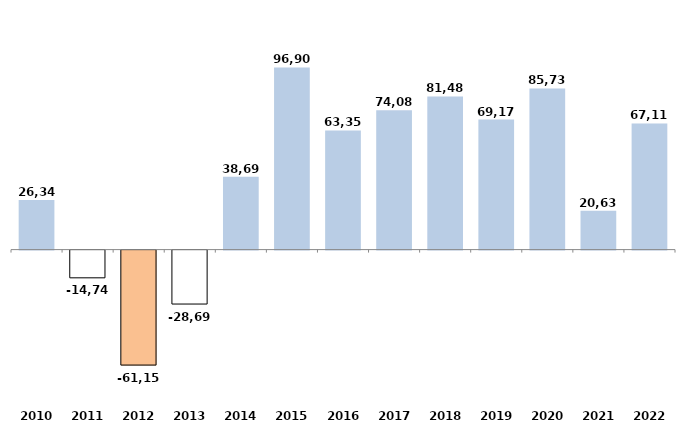
| Category | Series 0 |
|---|---|
| 2010 | 26340.1 |
| 2011 | -14744.2 |
| 2012 | -61155.6 |
| 2013 | -28691.44 |
| 2014 | 38694.28 |
| 2015 | 96909.35 |
| 2016 | 63354.83 |
| 2017 | 74080.35 |
| 2018 | 81483.39 |
| 2019 | 69171.81 |
| 2020 | 85735.3 |
| 2021 | 20631.65 |
| 2022 | 67110.8 |